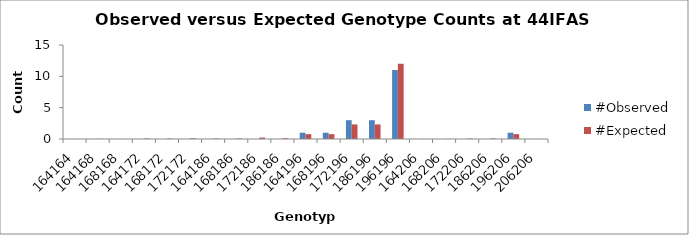
| Category | #Observed | #Expected |
|---|---|---|
| 164164.0 | 0 | 0.012 |
| 164168.0 | 0 | 0.025 |
| 168168.0 | 0 | 0.012 |
| 164172.0 | 0 | 0.075 |
| 168172.0 | 0 | 0.075 |
| 172172.0 | 0 | 0.112 |
| 164186.0 | 0 | 0.075 |
| 168186.0 | 0 | 0.075 |
| 172186.0 | 0 | 0.225 |
| 186186.0 | 0 | 0.112 |
| 164196.0 | 1 | 0.775 |
| 168196.0 | 1 | 0.775 |
| 172196.0 | 3 | 2.325 |
| 186196.0 | 3 | 2.325 |
| 196196.0 | 11 | 12.012 |
| 164206.0 | 0 | 0.025 |
| 168206.0 | 0 | 0.025 |
| 172206.0 | 0 | 0.075 |
| 186206.0 | 0 | 0.075 |
| 196206.0 | 1 | 0.775 |
| 206206.0 | 0 | 0.012 |